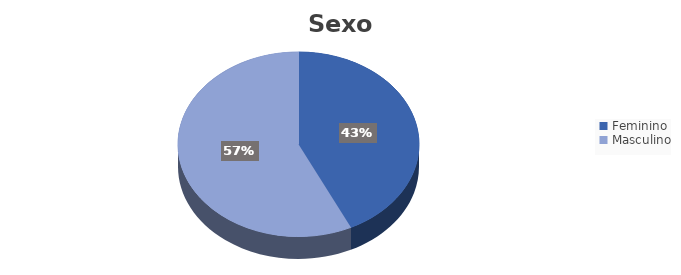
| Category | Series 0 |
|---|---|
| Feminino | 0.428 |
| Masculino | 0.572 |